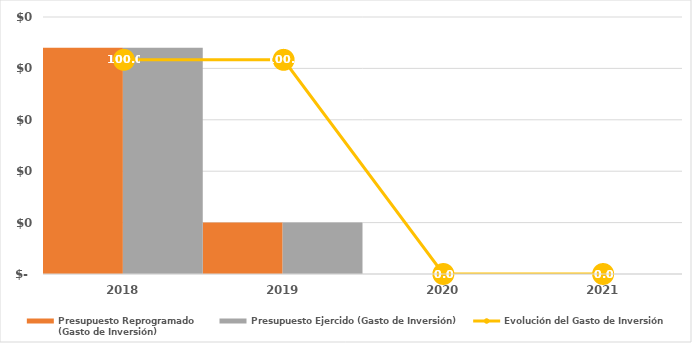
| Category | Presupuesto Reprogramado
(Gasto de Inversión) | Presupuesto Ejercido (Gasto de Inversión) |
|---|---|---|
| 2018.0 | 22 | 22 |
| 2019.0 | 5 | 5 |
| 2020.0 | 0 | 0 |
| 2021.0 | 0 | 0 |